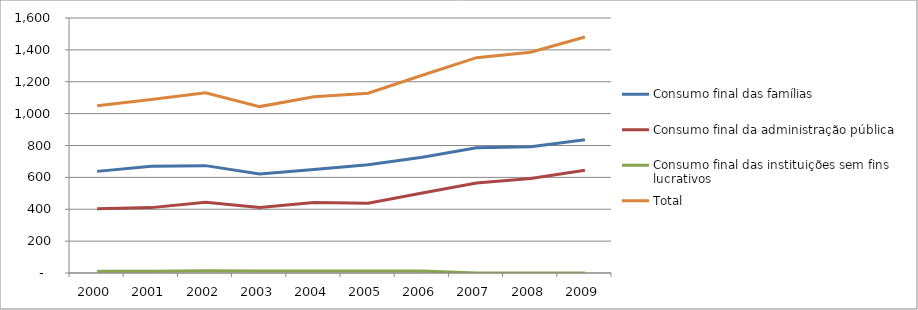
| Category | Consumo final das famílias | Consumo final da administração pública | Consumo final das instituições sem fins lucrativos | Total |
|---|---|---|---|---|
| 2000.0 | 637.659 | 402.534 | 11.286 | 1049.598 |
| 2001.0 | 670.302 | 410.211 | 10.473 | 1089.24 |
| 2002.0 | 673.714 | 443.275 | 14.402 | 1131.392 |
| 2003.0 | 620.78 | 411.148 | 12.172 | 1044.1 |
| 2004.0 | 650.133 | 442.752 | 12.723 | 1105.608 |
| 2005.0 | 678.694 | 437.595 | 12.055 | 1128.344 |
| 2006.0 | 726.523 | 501.535 | 12.89 | 1240.949 |
| 2007.0 | 786.162 | 565.018 | 0 | 1351.18 |
| 2008.0 | 792.867 | 592.321 | 0 | 1385.189 |
| 2009.0 | 835.65 | 645.27 | 0 | 1480.92 |